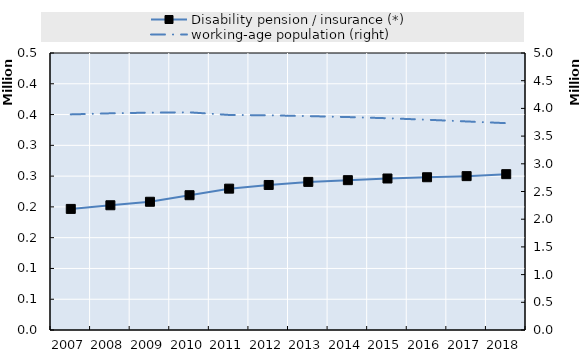
| Category | Disability pension / insurance (*) | Series 4 | Series 5 | Series 6 | Series 7 | Series 8 | Series 9 | Series 10 | Series 11 | Series 12 | Series 13 | Series 14 | Series 15 | Series 16 | Series 17 | Series 18 | Series 19 |
|---|---|---|---|---|---|---|---|---|---|---|---|---|---|---|---|---|---|
| 2007.0 | 196705 |  |  |  |  |  |  |  |  |  |  |  |  |  |  |  |  |
| 2008.0 | 202657 |  |  |  |  |  |  |  |  |  |  |  |  |  |  |  |  |
| 2009.0 | 208347 |  |  |  |  |  |  |  |  |  |  |  |  |  |  |  |  |
| 2010.0 | 218980 |  |  |  |  |  |  |  |  |  |  |  |  |  |  |  |  |
| 2011.0 | 229632 |  |  |  |  |  |  |  |  |  |  |  |  |  |  |  |  |
| 2012.0 | 235601 |  |  |  |  |  |  |  |  |  |  |  |  |  |  |  |  |
| 2013.0 | 240607 |  |  |  |  |  |  |  |  |  |  |  |  |  |  |  |  |
| 2014.0 | 243423 |  |  |  |  |  |  |  |  |  |  |  |  |  |  |  |  |
| 2015.0 | 246132 |  |  |  |  |  |  |  |  |  |  |  |  |  |  |  |  |
| 2016.0 | 248160 |  |  |  |  |  |  |  |  |  |  |  |  |  |  |  |  |
| 2017.0 | 249966 |  |  |  |  |  |  |  |  |  |  |  |  |  |  |  |  |
| 2018.0 | 253169 |  |  |  |  |  |  |  |  |  |  |  |  |  |  |  |  |